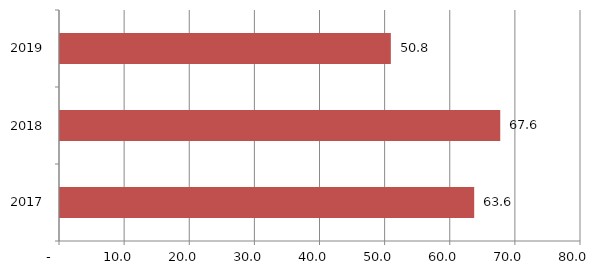
| Category | Series 0 |
|---|---|
| 2017.0 | 63.6 |
| 2018.0 | 67.6 |
| 2019.0 | 50.8 |